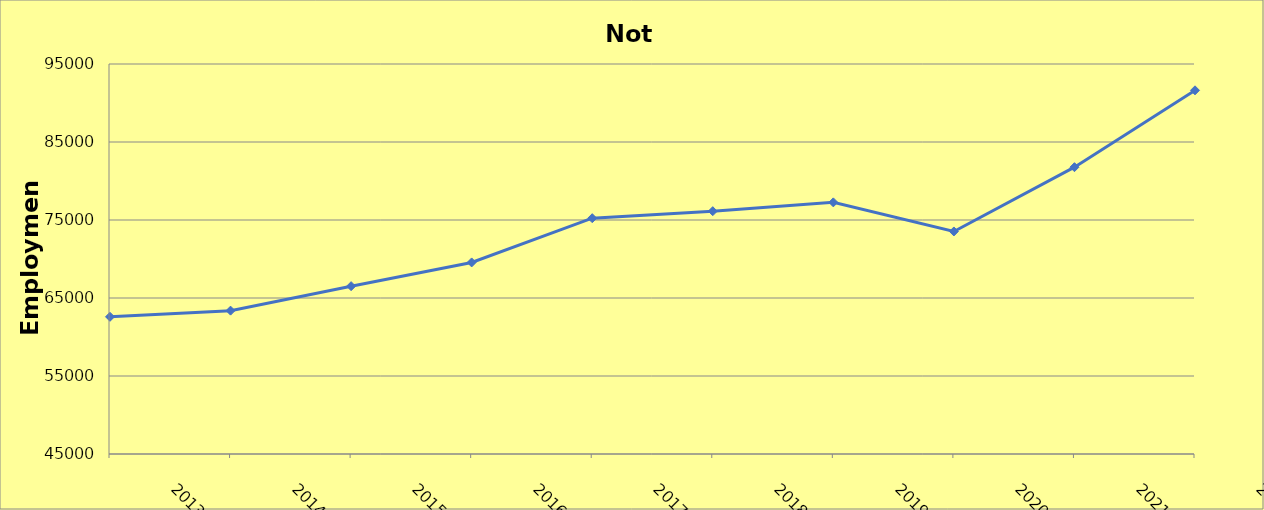
| Category | Not Classified |
|---|---|
| 2013.0 | 62590 |
| 2014.0 | 63380 |
| 2015.0 | 66518 |
| 2016.0 | 69560 |
| 2017.0 | 75232 |
| 2018.0 | 76130 |
| 2019.0 | 77260 |
| 2020.0 | 73530 |
| 2021.0 | 81770 |
| 2022.0 | 91625 |